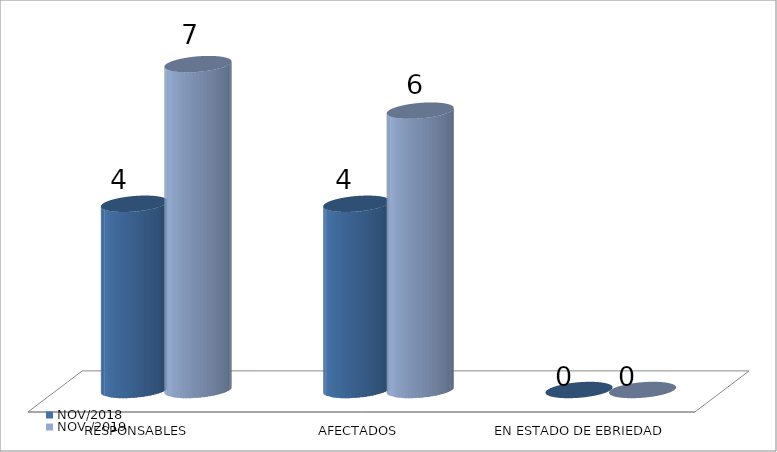
| Category | NOV/2018 | NOV /2019 |
|---|---|---|
| RESPONSABLES | 4 | 7 |
| AFECTADOS | 4 | 6 |
| EN ESTADO DE EBRIEDAD | 0 | 0 |